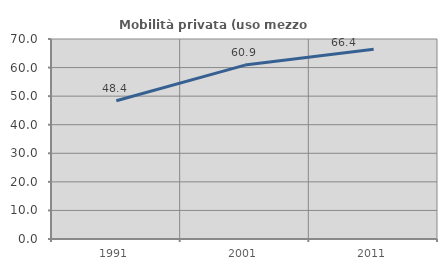
| Category | Mobilità privata (uso mezzo privato) |
|---|---|
| 1991.0 | 48.399 |
| 2001.0 | 60.87 |
| 2011.0 | 66.429 |